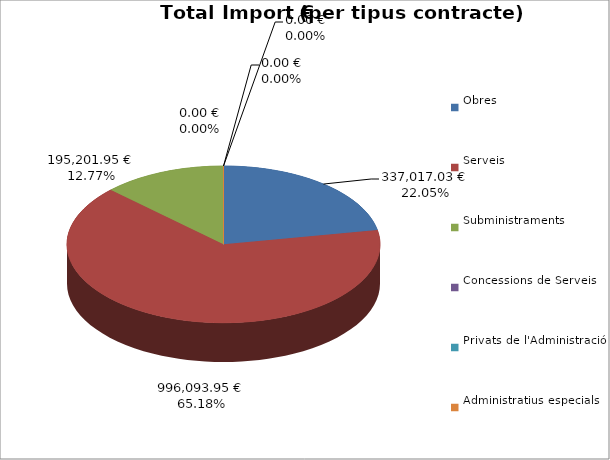
| Category | Total preu
(amb IVA) |
|---|---|
| Obres | 337017.03 |
| Serveis | 996093.946 |
| Subministraments | 195201.95 |
| Concessions de Serveis | 0 |
| Privats de l'Administració | 0 |
| Administratius especials | 0 |